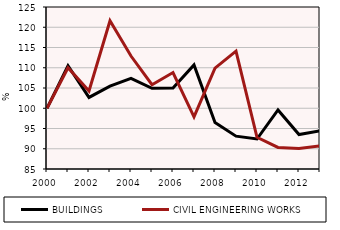
| Category | BUILDINGS | CIVIL ENGINEERING WORKS |
|---|---|---|
| 2000.0 | 100 | 100 |
| 2001.0 | 110.509 | 110.006 |
| 2002.0 | 102.67 | 104.268 |
| 2003.0 | 105.46 | 121.614 |
| 2004.0 | 107.398 | 112.891 |
| 2005.0 | 104.915 | 105.821 |
| 2006.0 | 104.977 | 108.827 |
| 2007.0 | 110.694 | 97.881 |
| 2008.0 | 96.492 | 109.912 |
| 2009.0 | 93.104 | 114.087 |
| 2010.0 | 92.406 | 92.837 |
| 2011.0 | 99.583 | 90.328 |
| 2012.0 | 93.516 | 90.038 |
| 2013.0 | 94.437 | 90.716 |